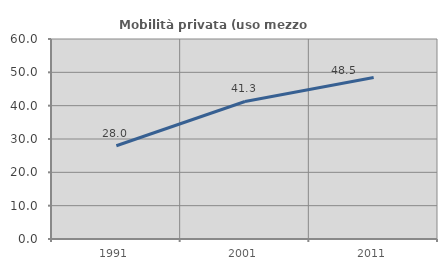
| Category | Mobilità privata (uso mezzo privato) |
|---|---|
| 1991.0 | 27.977 |
| 2001.0 | 41.256 |
| 2011.0 | 48.473 |